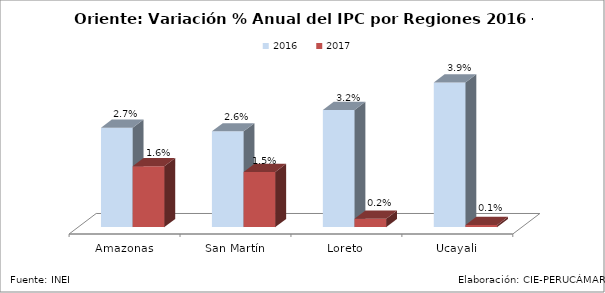
| Category | 2016 | 2017 |
|---|---|---|
| Amazonas | 0.027 | 0.016 |
| San Martín | 0.026 | 0.015 |
| Loreto | 0.032 | 0.002 |
| Ucayali | 0.039 | 0.001 |